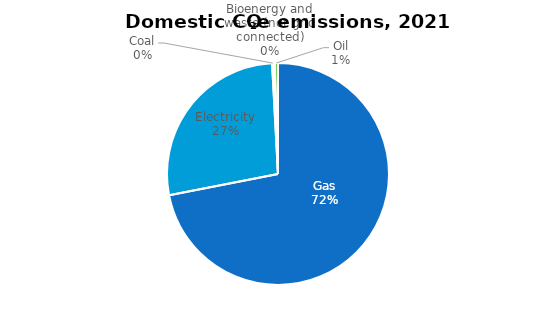
| Category | Series 0 |
|---|---|
| Gas | 7.368 |
| Electricity | 2.787 |
| Coal | 0.022 |
| Bioenergy and waste (not grid connected) | 0.017 |
| Oil | 0.049 |